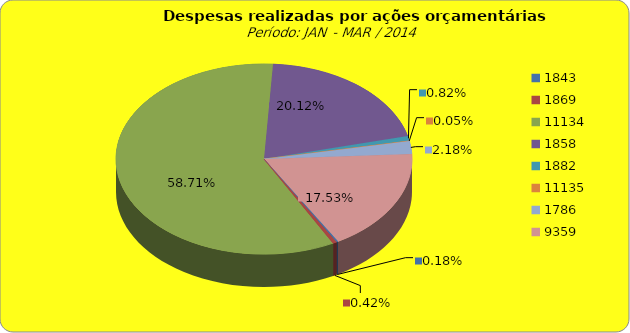
| Category | Series 1 |
|---|---|
| 1843.0 | 100000 |
| 1869.0 | 238667.3 |
| 11134.0 | 33058451.19 |
| 1858.0 | 11328655.48 |
| 1882.0 | 460659.2 |
| 11135.0 | 29625.52 |
| 1786.0 | 1226093.42 |
| 9359.0 | 9868911.18 |